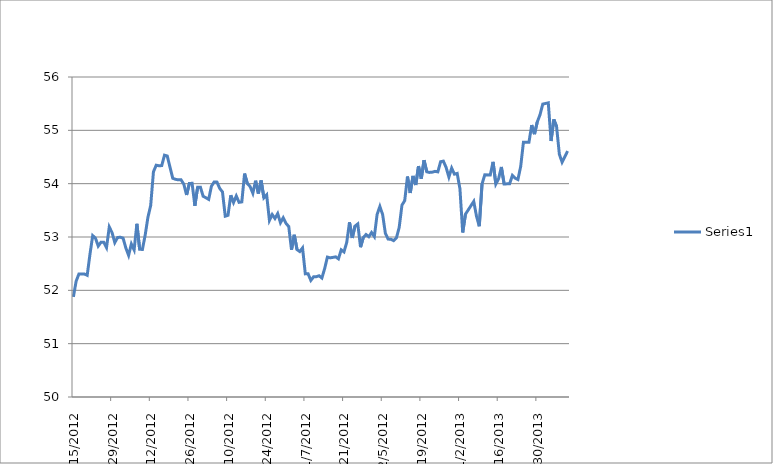
| Category | Series 0 |
|---|---|
| 8/15/12 | 51.877 |
| 8/16/12 | 52.171 |
| 8/17/12 | 52.306 |
| 8/18/12 | 52.307 |
| 8/19/12 | 52.307 |
| 8/20/12 | 52.281 |
| 8/21/12 | 52.674 |
| 8/22/12 | 53.026 |
| 8/23/12 | 52.978 |
| 8/24/12 | 52.83 |
| 8/25/12 | 52.902 |
| 8/26/12 | 52.901 |
| 8/27/12 | 52.801 |
| 8/28/12 | 53.188 |
| 8/29/12 | 53.083 |
| 8/30/12 | 52.895 |
| 8/31/12 | 52.99 |
| 9/1/12 | 52.996 |
| 9/2/12 | 52.979 |
| 9/3/12 | 52.795 |
| 9/4/12 | 52.656 |
| 9/5/12 | 52.869 |
| 9/6/12 | 52.759 |
| 9/7/12 | 53.247 |
| 9/8/12 | 52.769 |
| 9/9/12 | 52.767 |
| 9/10/12 | 53.034 |
| 9/11/12 | 53.37 |
| 9/12/12 | 53.592 |
| 9/13/12 | 54.224 |
| 9/14/12 | 54.346 |
| 9/15/12 | 54.336 |
| 9/16/12 | 54.339 |
| 9/17/12 | 54.534 |
| 9/18/12 | 54.519 |
| 9/19/12 | 54.307 |
| 9/20/12 | 54.1 |
| 9/21/12 | 54.081 |
| 9/22/12 | 54.072 |
| 9/23/12 | 54.072 |
| 9/24/12 | 53.989 |
| 9/25/12 | 53.788 |
| 9/26/12 | 54.004 |
| 9/27/12 | 54.007 |
| 9/28/12 | 53.585 |
| 9/29/12 | 53.934 |
| 9/30/12 | 53.935 |
| 10/1/12 | 53.763 |
| 10/2/12 | 53.736 |
| 10/3/12 | 53.705 |
| 10/4/12 | 53.953 |
| 10/5/12 | 54.033 |
| 10/6/12 | 54.03 |
| 10/7/12 | 53.912 |
| 10/8/12 | 53.844 |
| 10/9/12 | 53.39 |
| 10/10/12 | 53.407 |
| 10/11/12 | 53.783 |
| 10/12/12 | 53.645 |
| 10/13/12 | 53.769 |
| 10/14/12 | 53.65 |
| 10/15/12 | 53.658 |
| 10/16/12 | 54.189 |
| 10/17/12 | 54.004 |
| 10/18/12 | 53.947 |
| 10/19/12 | 53.821 |
| 10/20/12 | 54.056 |
| 10/21/12 | 53.815 |
| 10/22/12 | 54.06 |
| 10/23/12 | 53.735 |
| 10/24/12 | 53.791 |
| 10/25/12 | 53.311 |
| 10/26/12 | 53.421 |
| 10/27/12 | 53.347 |
| 10/28/12 | 53.439 |
| 10/29/12 | 53.268 |
| 10/30/12 | 53.361 |
| 10/31/12 | 53.256 |
| 11/1/12 | 53.196 |
| 11/2/12 | 52.76 |
| 11/3/12 | 53.041 |
| 11/4/12 | 52.763 |
| 11/5/12 | 52.728 |
| 11/6/12 | 52.795 |
| 11/7/12 | 52.309 |
| 11/8/12 | 52.311 |
| 11/9/12 | 52.186 |
| 11/10/12 | 52.253 |
| 11/11/12 | 52.256 |
| 11/12/12 | 52.273 |
| 11/13/12 | 52.231 |
| 11/14/12 | 52.407 |
| 11/15/12 | 52.623 |
| 11/16/12 | 52.609 |
| 11/17/12 | 52.618 |
| 11/18/12 | 52.628 |
| 11/19/12 | 52.591 |
| 11/20/12 | 52.759 |
| 11/21/12 | 52.72 |
| 11/22/12 | 52.899 |
| 11/23/12 | 53.275 |
| 11/24/12 | 52.982 |
| 11/25/12 | 53.205 |
| 11/26/12 | 53.245 |
| 11/27/12 | 52.809 |
| 11/28/12 | 52.991 |
| 11/29/12 | 53.046 |
| 11/30/12 | 53.006 |
| 12/1/12 | 53.084 |
| 12/2/12 | 53.008 |
| 12/3/12 | 53.423 |
| 12/4/12 | 53.573 |
| 12/5/12 | 53.421 |
| 12/6/12 | 53.067 |
| 12/7/12 | 52.961 |
| 12/8/12 | 52.958 |
| 12/9/12 | 52.932 |
| 12/10/12 | 52.984 |
| 12/11/12 | 53.179 |
| 12/12/12 | 53.598 |
| 12/13/12 | 53.682 |
| 12/14/12 | 54.134 |
| 12/15/12 | 53.825 |
| 12/16/12 | 54.145 |
| 12/17/12 | 53.975 |
| 12/18/12 | 54.329 |
| 12/19/12 | 54.093 |
| 12/20/12 | 54.441 |
| 12/21/12 | 54.222 |
| 12/22/12 | 54.211 |
| 12/23/12 | 54.216 |
| 12/24/12 | 54.231 |
| 12/25/12 | 54.221 |
| 12/26/12 | 54.412 |
| 12/27/12 | 54.423 |
| 12/28/12 | 54.303 |
| 12/29/12 | 54.124 |
| 12/30/12 | 54.292 |
| 12/31/12 | 54.178 |
| 1/1/13 | 54.192 |
| 1/2/13 | 53.904 |
| 1/3/13 | 53.085 |
| 1/4/13 | 53.427 |
| 1/7/13 | 53.667 |
| 1/8/13 | 53.389 |
| 1/9/13 | 53.201 |
| 1/10/13 | 53.993 |
| 1/11/13 | 54.168 |
| 1/13/13 | 54.164 |
| 1/14/13 | 54.409 |
| 1/15/13 | 53.993 |
| 1/16/13 | 54.092 |
| 1/17/13 | 54.313 |
| 1/18/13 | 53.995 |
| 1/20/13 | 53.998 |
| 1/21/13 | 54.155 |
| 1/22/13 | 54.104 |
| 1/23/13 | 54.078 |
| 1/24/13 | 54.321 |
| 1/25/13 | 54.777 |
| 1/27/13 | 54.778 |
| 1/28/13 | 55.099 |
| 1/29/13 | 54.929 |
| 1/30/13 | 55.156 |
| 1/31/13 | 55.292 |
| 2/1/13 | 55.492 |
| 2/3/13 | 55.515 |
| 2/4/13 | 54.8 |
| 2/5/13 | 55.204 |
| 2/6/13 | 55.071 |
| 2/7/13 | 54.554 |
| 2/8/13 | 54.402 |
| 2/10/13 | 54.612 |